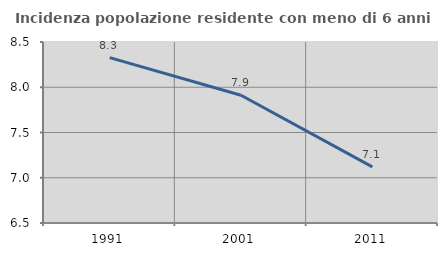
| Category | Incidenza popolazione residente con meno di 6 anni |
|---|---|
| 1991.0 | 8.327 |
| 2001.0 | 7.911 |
| 2011.0 | 7.121 |